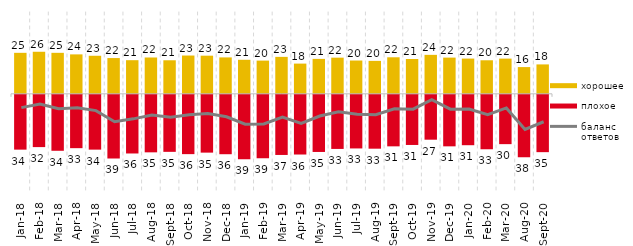
| Category | хорошее | плохое |
|---|---|---|
| 2018-01-01 | 25.05 | -33.5 |
| 2018-02-01 | 25.7 | -31.95 |
| 2018-03-01 | 25.05 | -34.2 |
| 2018-04-01 | 24.1 | -32.6 |
| 2018-05-01 | 23.25 | -33.5 |
| 2018-06-01 | 21.85 | -38.9 |
| 2018-07-01 | 20.55 | -35.85 |
| 2018-08-01 | 22.2 | -35.15 |
| 2018-09-01 | 20.5 | -34.85 |
| 2018-10-01 | 23.4 | -36.25 |
| 2018-11-01 | 23.303 | -35.329 |
| 2018-12-01 | 22.25 | -36.3 |
| 2019-01-01 | 20.8 | -39.35 |
| 2019-02-01 | 20.3 | -38.75 |
| 2019-03-01 | 22.576 | -36.748 |
| 2019-04-01 | 18.465 | -36.485 |
| 2019-05-01 | 21.347 | -34.918 |
| 2019-06-01 | 22.095 | -33.067 |
| 2019-07-01 | 20.347 | -32.772 |
| 2019-08-01 | 20.13 | -32.917 |
| 2019-09-01 | 22.327 | -31.485 |
| 2019-10-01 | 21.287 | -30.644 |
| 2019-11-01 | 23.812 | -27.426 |
| 2019-12-01 | 22.129 | -31.485 |
| 2020-01-01 | 21.535 | -30.792 |
| 2020-02-01 | 20.495 | -33.267 |
| 2020-03-01 | 21.517 | -30.144 |
| 2020-08-01 | 16.336 | -38.083 |
| 2020-09-01 | 17.969 | -35.042 |